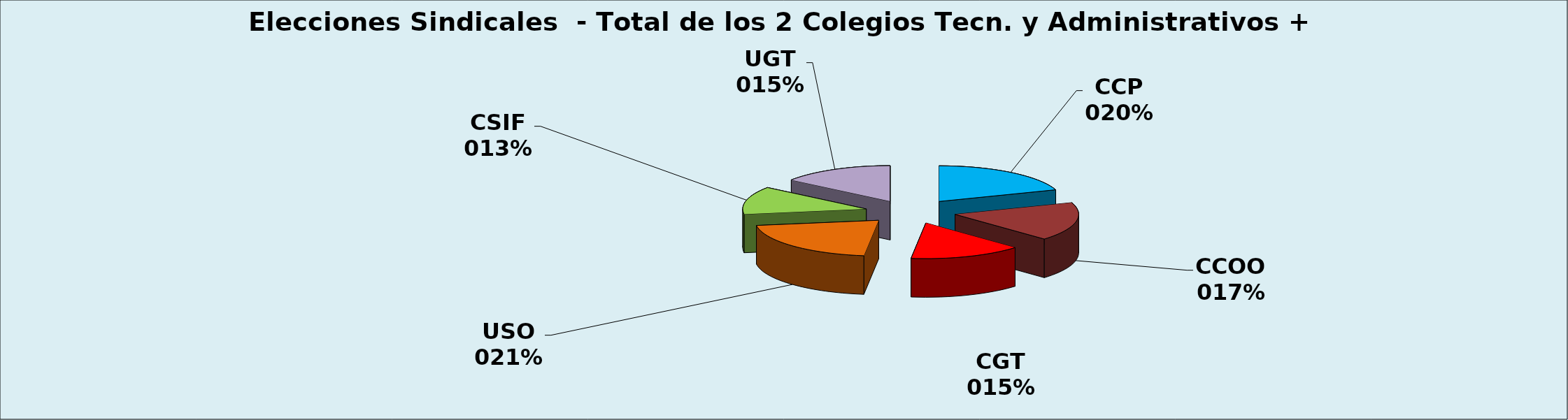
| Category | TOTAL |
|---|---|
| CCP | 180 |
| CCOO | 160 |
| CGT | 135 |
| USO | 190 |
| CSIF | 115 |
| UGT | 135 |